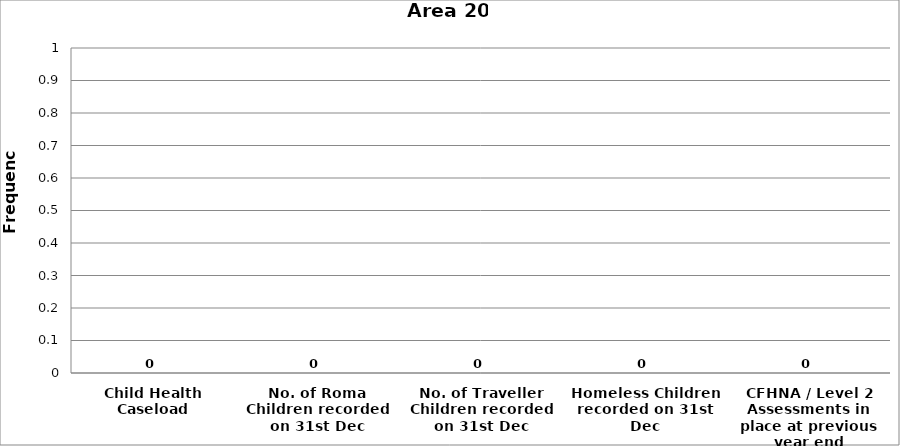
| Category | Area 20 |
|---|---|
| Child Health Caseload | 0 |
| No. of Roma Children recorded on 31st Dec | 0 |
| No. of Traveller Children recorded on 31st Dec | 0 |
| Homeless Children recorded on 31st Dec | 0 |
| CFHNA / Level 2 Assessments in place at previous year end | 0 |